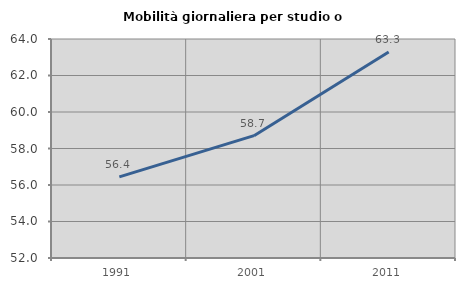
| Category | Mobilità giornaliera per studio o lavoro |
|---|---|
| 1991.0 | 56.447 |
| 2001.0 | 58.703 |
| 2011.0 | 63.288 |